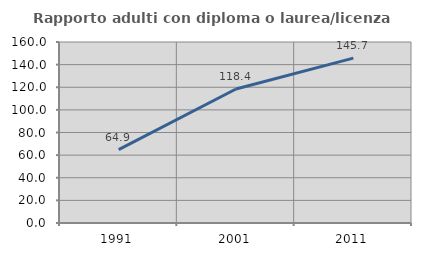
| Category | Rapporto adulti con diploma o laurea/licenza media  |
|---|---|
| 1991.0 | 64.906 |
| 2001.0 | 118.421 |
| 2011.0 | 145.714 |